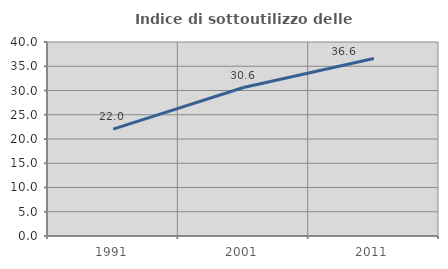
| Category | Indice di sottoutilizzo delle abitazioni  |
|---|---|
| 1991.0 | 22.039 |
| 2001.0 | 30.609 |
| 2011.0 | 36.602 |